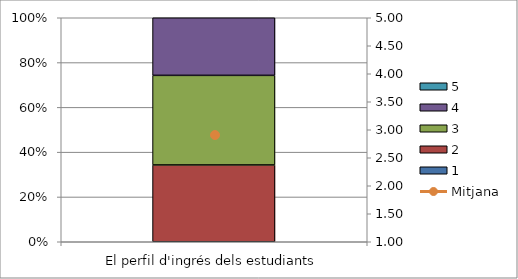
| Category | 1 | 2 | 3 | 4 | 5 |
|---|---|---|---|---|---|
| El perfil d'ingrés dels estudiants | 0 | 12 | 14 | 9 | 0 |